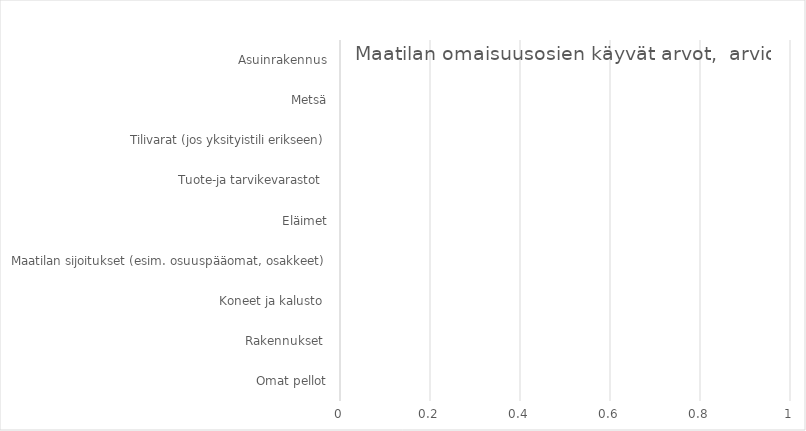
| Category | Series 0 |
|---|---|
| Omat pellot | 0 |
| Rakennukset  | 0 |
| Koneet ja kalusto  | 0 |
| Maatilan sijoitukset (esim. osuuspääomat, osakkeet) | 0 |
| Eläimet | 0 |
| Tuote-ja tarvikevarastot  | 0 |
| Tilivarat (jos yksityistili erikseen) | 0 |
| Metsä | 0 |
| Asuinrakennus | 0 |